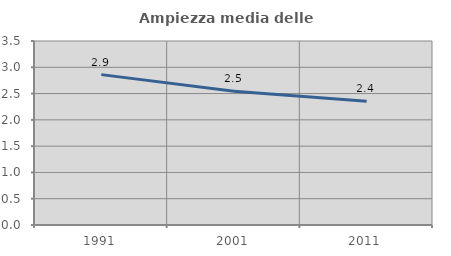
| Category | Ampiezza media delle famiglie |
|---|---|
| 1991.0 | 2.86 |
| 2001.0 | 2.544 |
| 2011.0 | 2.353 |